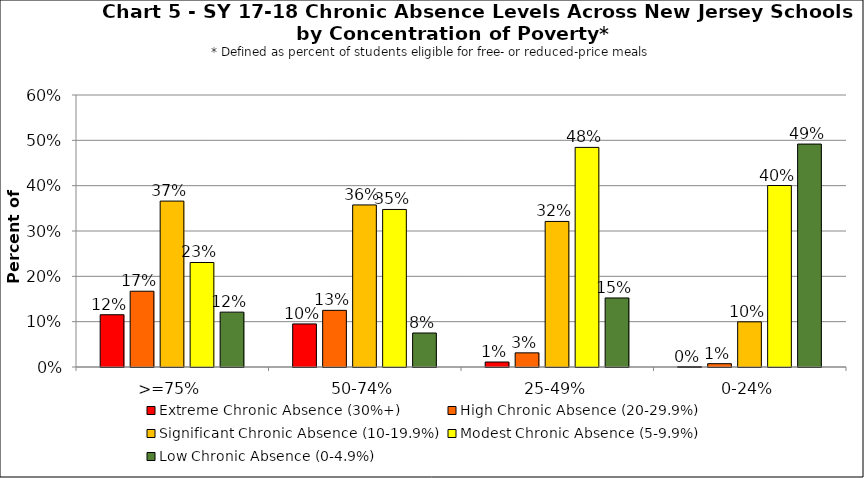
| Category | Extreme Chronic Absence (30%+) | High Chronic Absence (20-29.9%) | Significant Chronic Absence (10-19.9%) | Modest Chronic Absence (5-9.9%) | Low Chronic Absence (0-4.9%) |
|---|---|---|---|---|---|
| 0 | 0.115 | 0.167 | 0.366 | 0.231 | 0.121 |
| 1 | 0.095 | 0.125 | 0.358 | 0.348 | 0.075 |
| 2 | 0.011 | 0.031 | 0.321 | 0.484 | 0.152 |
| 3 | 0.001 | 0.007 | 0.1 | 0.4 | 0.492 |